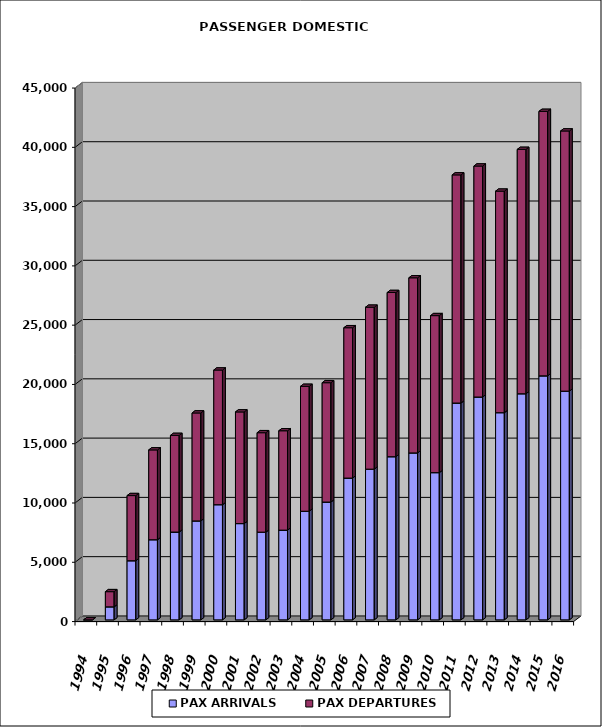
| Category | PAX ARRIVALS | PAX DEPARTURES |
|---|---|---|
| 1994.0 | 0 | 0 |
| 1995.0 | 1100 | 1279 |
| 1996.0 | 4988 | 5495 |
| 1997.0 | 6761 | 7576 |
| 1998.0 | 7408 | 8150 |
| 1999.0 | 8348 | 9105 |
| 2000.0 | 9716 | 11359 |
| 2001.0 | 8121 | 9419 |
| 2002.0 | 7400 | 8387 |
| 2003.0 | 7571 | 8381 |
| 2004.0 | 9164 | 10534 |
| 2005.0 | 9939 | 10065 |
| 2006.0 | 11961 | 12681 |
| 2007.0 | 12714 | 13658 |
| 2008.0 | 13764 | 13849 |
| 2009.0 | 14084 | 14771 |
| 2010.0 | 12419 | 13245 |
| 2011.0 | 18291 | 19243 |
| 2012.0 | 18799 | 19483 |
| 2013.0 | 17477 | 18685 |
| 2014.0 | 19074 | 20612 |
| 2015.0 | 20584 | 22308 |
| 2016.0 | 19292 | 21947 |